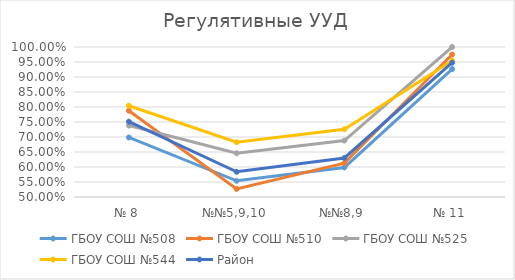
| Category | ГБОУ СОШ №508 | ГБОУ СОШ №510 | ГБОУ СОШ №525 | ГБОУ СОШ №544 | Район |
|---|---|---|---|---|---|
| № 8 | 0.698 | 0.788 | 0.738 | 0.804 | 0.751 |
| №№5,9,10 | 0.554 | 0.527 | 0.646 | 0.683 | 0.584 |
| №№8,9 | 0.598 | 0.612 | 0.688 | 0.726 | 0.63 |
| № 11 | 0.926 | 0.975 | 1 | 0.954 | 0.948 |